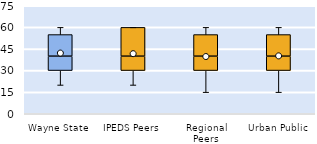
| Category | 25th | 50th | 75th |
|---|---|---|---|
| Wayne State | 30 | 10 | 15 |
| IPEDS Peers | 30 | 10 | 20 |
| Regional Peers | 30 | 10 | 15 |
| Urban Public | 30 | 10 | 15 |